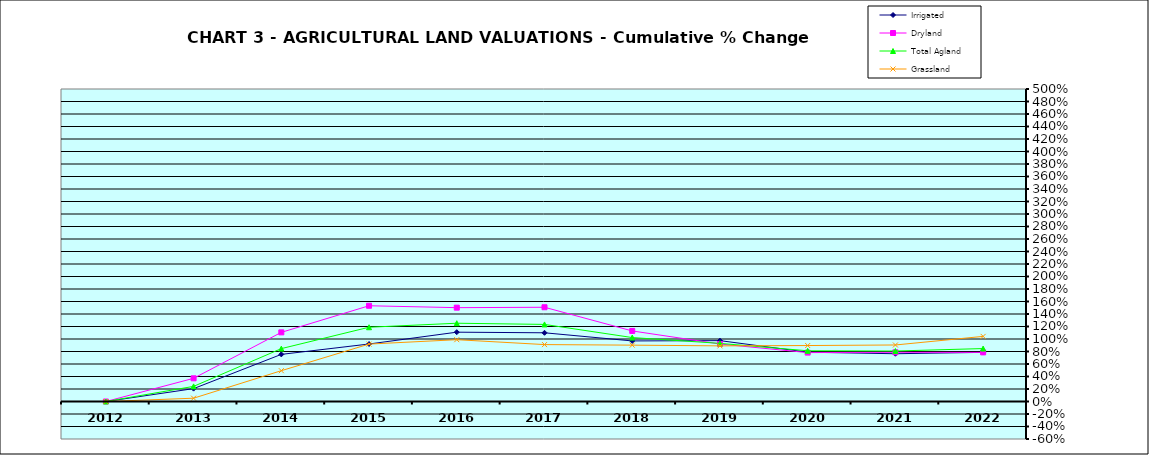
| Category | Irrigated | Dryland | Total Agland | Grassland |
|---|---|---|---|---|
| 2012.0 | 0 | 0 | 0 | 0 |
| 2013.0 | 0.206 | 0.371 | 0.242 | 0.053 |
| 2014.0 | 0.754 | 1.106 | 0.846 | 0.493 |
| 2015.0 | 0.92 | 1.532 | 1.188 | 0.919 |
| 2016.0 | 1.109 | 1.501 | 1.252 | 0.989 |
| 2017.0 | 1.099 | 1.508 | 1.233 | 0.911 |
| 2018.0 | 0.969 | 1.129 | 1.023 | 0.902 |
| 2019.0 | 0.974 | 0.92 | 0.93 | 0.89 |
| 2020.0 | 0.789 | 0.782 | 0.811 | 0.895 |
| 2021.0 | 0.764 | 0.787 | 0.808 | 0.904 |
| 2022.0 | 0.786 | 0.786 | 0.847 | 1.042 |